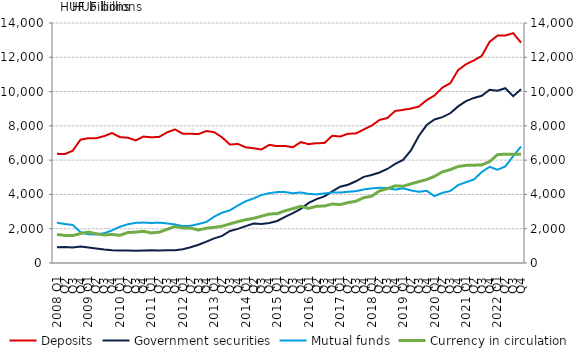
| Category | Deposits | Government securities |
|---|---|---|
| 2008 Q1 | 6369.078 | 923.097 |
| Q2 | 6353.118 | 931.39 |
| Q3 | 6545.865 | 906.504 |
| Q4 | 7195.751 | 962.149 |
| 2009 Q1 | 7279.039 | 905.838 |
| Q2 | 7280.739 | 850.708 |
| Q3 | 7401.98 | 786.905 |
| Q4 | 7581.462 | 746.744 |
| 2010 Q1 | 7344.556 | 729.781 |
| Q2 | 7309.284 | 723.671 |
| Q3 | 7151.434 | 720.547 |
| Q4 | 7376.127 | 729.849 |
| 2011 Q1 | 7331.236 | 741.081 |
| Q2 | 7357.487 | 735.56 |
| Q3 | 7620.95 | 738.711 |
| Q4 | 7792.493 | 748.232 |
| 2012 Q1 | 7541.756 | 802.887 |
| Q2 | 7538.73 | 915.513 |
| Q3 | 7518.398 | 1061.912 |
| Q4 | 7697.379 | 1245.713 |
| 2013 Q1 | 7631.341 | 1436.118 |
| Q2 | 7325.034 | 1579.732 |
| Q3 | 6907.43 | 1871.773 |
| Q4 | 6946.278 | 1990.515 |
| 2014 Q1 | 6748.188 | 2148.923 |
| Q2 | 6694.451 | 2301.95 |
| Q3 | 6621.693 | 2270.877 |
| Q4 | 6892.237 | 2329.773 |
| 2015 Q1 | 6818.008 | 2449.915 |
| Q2 | 6826.452 | 2691.503 |
| Q3 | 6754.516 | 2910.544 |
| Q4 | 7051.513 | 3159.8 |
| 2016 Q1 | 6930.932 | 3506.213 |
| Q2 | 6991.037 | 3726.482 |
| Q3 | 6994.031 | 3888.133 |
| Q4 | 7424.79 | 4178.84 |
| 2017 Q1 | 7377.157 | 4451.344 |
| Q2 | 7541.027 | 4565.608 |
| Q3 | 7554.234 | 4767.429 |
| Q4 | 7791.066 | 5024.922 |
| 2018 Q1 | 8012.701 | 5131.929 |
| Q2 | 8341.826 | 5281.653 |
| Q3 | 8458.359 | 5484.123 |
| Q4 | 8868.953 | 5778.729 |
| 2019 Q1 | 8934.014 | 6017.98 |
| Q2 | 9008.278 | 6572.216 |
| Q3 | 9125.526 | 7407.438 |
| Q4 | 9499.629 | 8047.086 |
| 2020 Q1 | 9772.197 | 8369.14 |
| Q2 | 10235.749 | 8510.235 |
| Q3 | 10486.847 | 8733.518 |
| Q4 | 11255.255 | 9135.601 |
| 2021 Q1 | 11596.913 | 9446.905 |
| Q2 | 11817.469 | 9629.955 |
| Q3 | 12080.462 | 9757.916 |
| Q4 | 12899.115 | 10110.003 |
| 2022 Q1 | 13264.434 | 10045.567 |
| Q2 | 13268.665 | 10196.268 |
| Q3 | 13407.094 | 9729.02 |
| Q4 | 12850.868 | 10140.231 |